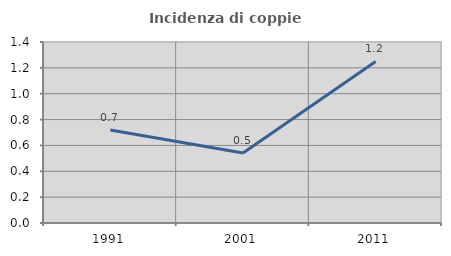
| Category | Incidenza di coppie miste |
|---|---|
| 1991.0 | 0.719 |
| 2001.0 | 0.541 |
| 2011.0 | 1.25 |